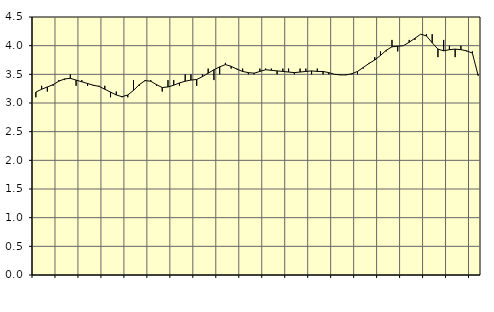
| Category | Piggar | Personliga och kulturella tjänster, SNI 90-98 |
|---|---|---|
| nan | 3.1 | 3.19 |
| 1.0 | 3.3 | 3.24 |
| 1.0 | 3.2 | 3.28 |
| 1.0 | 3.3 | 3.32 |
| nan | 3.4 | 3.38 |
| 2.0 | 3.4 | 3.42 |
| 2.0 | 3.5 | 3.43 |
| 2.0 | 3.3 | 3.4 |
| nan | 3.4 | 3.37 |
| 3.0 | 3.3 | 3.34 |
| 3.0 | 3.3 | 3.31 |
| 3.0 | 3.3 | 3.29 |
| nan | 3.3 | 3.24 |
| 4.0 | 3.1 | 3.19 |
| 4.0 | 3.2 | 3.14 |
| 4.0 | 3.1 | 3.11 |
| nan | 3.1 | 3.14 |
| 5.0 | 3.4 | 3.22 |
| 5.0 | 3.3 | 3.32 |
| 5.0 | 3.4 | 3.39 |
| nan | 3.4 | 3.38 |
| 6.0 | 3.3 | 3.32 |
| 6.0 | 3.2 | 3.27 |
| 6.0 | 3.4 | 3.28 |
| nan | 3.4 | 3.31 |
| 7.0 | 3.3 | 3.35 |
| 7.0 | 3.5 | 3.38 |
| 7.0 | 3.5 | 3.4 |
| nan | 3.3 | 3.41 |
| 8.0 | 3.5 | 3.46 |
| 8.0 | 3.6 | 3.52 |
| 8.0 | 3.4 | 3.58 |
| nan | 3.5 | 3.63 |
| 9.0 | 3.7 | 3.67 |
| 9.0 | 3.6 | 3.64 |
| 9.0 | 3.6 | 3.59 |
| nan | 3.6 | 3.55 |
| 10.0 | 3.5 | 3.53 |
| 10.0 | 3.5 | 3.52 |
| 10.0 | 3.6 | 3.55 |
| nan | 3.6 | 3.58 |
| 11.0 | 3.6 | 3.57 |
| 11.0 | 3.5 | 3.56 |
| 11.0 | 3.6 | 3.55 |
| nan | 3.6 | 3.54 |
| 12.0 | 3.5 | 3.53 |
| 12.0 | 3.6 | 3.54 |
| 12.0 | 3.6 | 3.55 |
| nan | 3.5 | 3.56 |
| 13.0 | 3.6 | 3.55 |
| 13.0 | 3.5 | 3.55 |
| 13.0 | 3.5 | 3.53 |
| nan | 3.5 | 3.5 |
| 14.0 | 3.5 | 3.49 |
| 14.0 | 3.5 | 3.49 |
| 14.0 | 3.5 | 3.51 |
| nan | 3.5 | 3.55 |
| 15.0 | 3.6 | 3.62 |
| 15.0 | 3.7 | 3.69 |
| 15.0 | 3.8 | 3.75 |
| nan | 3.9 | 3.83 |
| 16.0 | 3.9 | 3.92 |
| 16.0 | 4.1 | 3.98 |
| 16.0 | 3.9 | 3.99 |
| nan | 4 | 4 |
| 17.0 | 4.1 | 4.06 |
| 17.0 | 4.1 | 4.13 |
| 17.0 | 4.2 | 4.2 |
| nan | 4.2 | 4.17 |
| 18.0 | 4.2 | 4.05 |
| 18.0 | 3.8 | 3.94 |
| 18.0 | 4.1 | 3.91 |
| nan | 4 | 3.93 |
| 19.0 | 3.8 | 3.94 |
| 19.0 | 4 | 3.93 |
| 19.0 | 3.9 | 3.91 |
| nan | 3.9 | 3.87 |
| 20.0 | 3.5 | 3.48 |